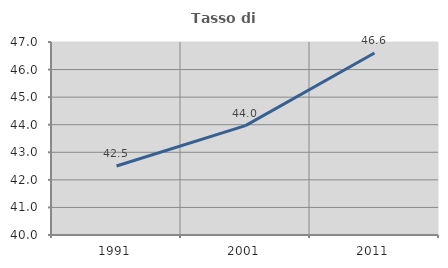
| Category | Tasso di occupazione   |
|---|---|
| 1991.0 | 42.502 |
| 2001.0 | 43.966 |
| 2011.0 | 46.602 |